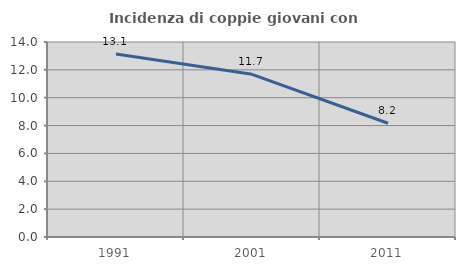
| Category | Incidenza di coppie giovani con figli |
|---|---|
| 1991.0 | 13.134 |
| 2001.0 | 11.679 |
| 2011.0 | 8.168 |